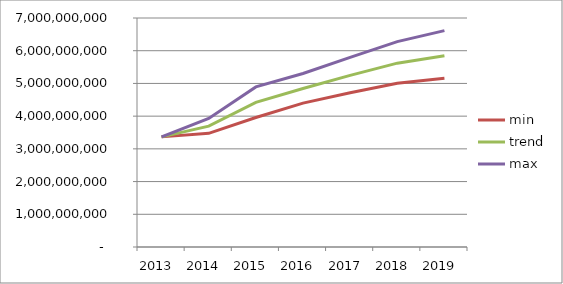
| Category |  min  |  trend  |  max  |
|---|---|---|---|
| 2013.0 | 3366364983.992 | 3366364983.992 | 3366364983.992 |
| 2014.0 | 3474165685.165 | 3694845642.736 | 3930411765.832 |
| 2015.0 | 3958095559.802 | 4419768623.647 | 4893339545.609 |
| 2016.0 | 4398706250.9 | 4845288332.481 | 5302656176.05 |
| 2017.0 | 4716490548.959 | 5246962026.784 | 5794318526.642 |
| 2018.0 | 5005739907.951 | 5619674542.287 | 6277852033.203 |
| 2019.0 | 5157370171.434 | 5843605891.502 | 6613590025.057 |